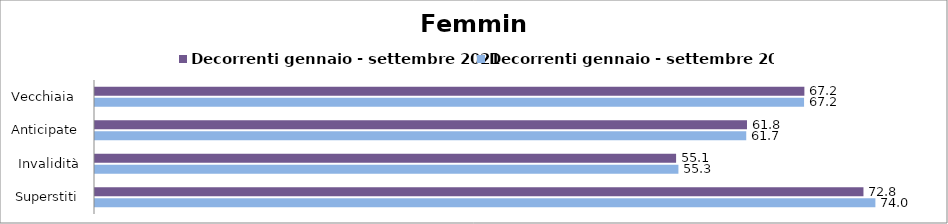
| Category | Decorrenti gennaio - settembre 2021 | Decorrenti gennaio - settembre 2022 |
|---|---|---|
| Vecchiaia  | 67.24 | 67.21 |
| Anticipate | 61.8 | 61.73 |
| Invalidità | 55.08 | 55.3 |
| Superstiti | 72.84 | 73.97 |